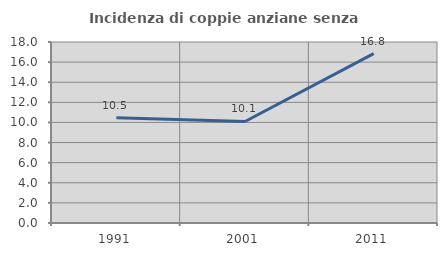
| Category | Incidenza di coppie anziane senza figli  |
|---|---|
| 1991.0 | 10.476 |
| 2001.0 | 10.096 |
| 2011.0 | 16.837 |